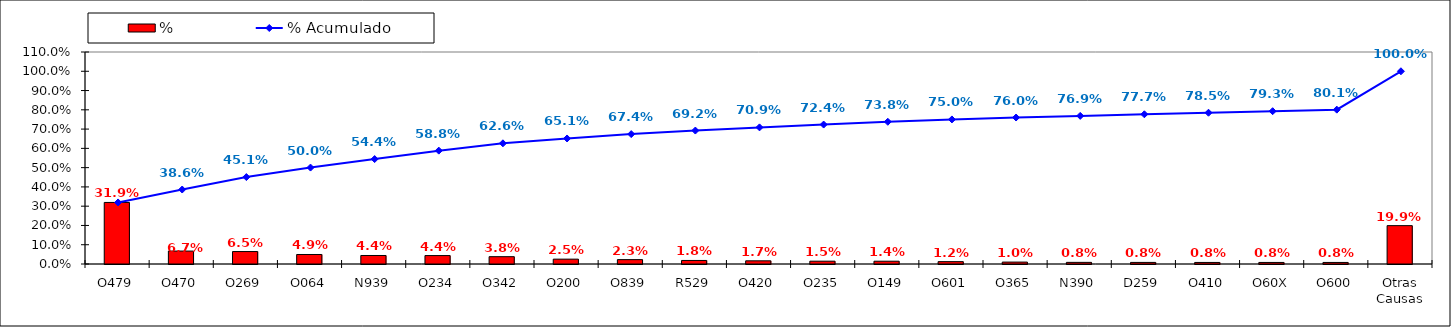
| Category | % |
|---|---|
| O479 | 0.319 |
| O470 | 0.067 |
| O269 | 0.065 |
| O064 | 0.049 |
| N939 | 0.044 |
| O234 | 0.044 |
| O342 | 0.038 |
| O200 | 0.025 |
| O839 | 0.023 |
| R529 | 0.018 |
| O420 | 0.017 |
| O235 | 0.015 |
| O149 | 0.014 |
| O601 | 0.012 |
| O365 | 0.01 |
| N390 | 0.008 |
| D259 | 0.008 |
| O410 | 0.008 |
| O60X | 0.008 |
| O600 | 0.008 |
| Otras Causas | 0.199 |